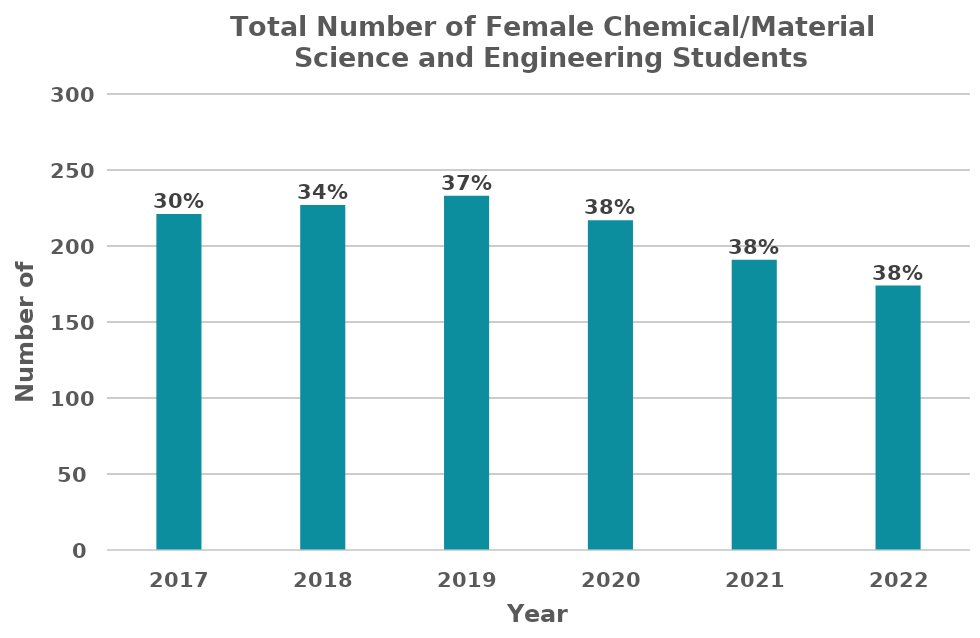
| Category | Total Number of Female Biosystem Engineering Students |
|---|---|
| 2017.0 | 221 |
| 2018.0 | 227 |
| 2019.0 | 233 |
| 2020.0 | 217 |
| 2021.0 | 191 |
| 2022.0 | 174 |